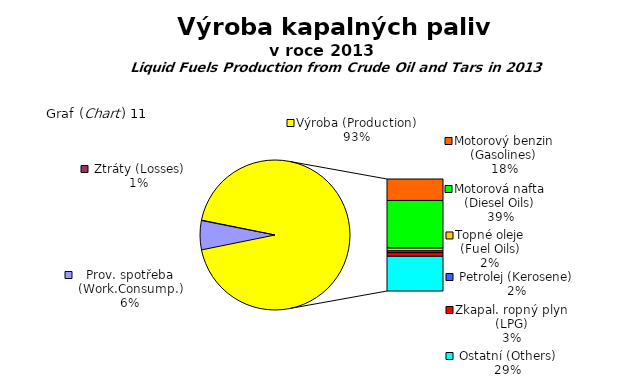
| Category | Series 0 |
|---|---|
| Prov. spotřeba (Work.Consump.) | 19777755.115 |
| Ztráty (Losses) | 260921.408 |
| Motorový benzin (Gasolines) | 56500025.868 |
| Motorová nafta (Diesel Oils) | 125326188.01 |
| Topné oleje (Fuel Oils) | 7339287.283 |
| Petrolej (Kerosene) | 4768528.934 |
| Zkapal. ropný plyn (LPG) | 9517155.489 |
| Ostatní (Others) | 91313647.787 |